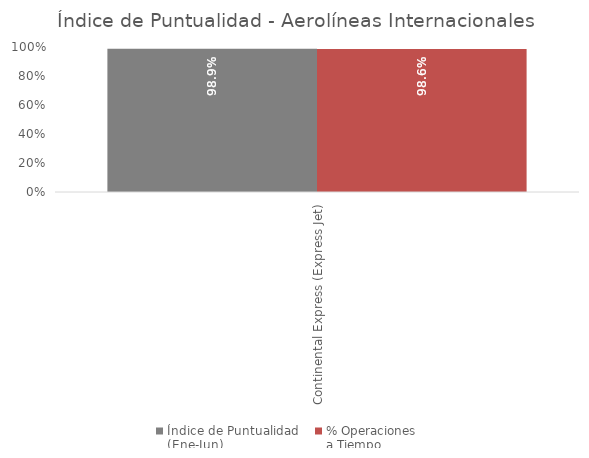
| Category | Índice de Puntualidad
(Ene-Jun) | % Operaciones 
a Tiempo |
|---|---|---|
| Continental Express (Express Jet) | 0.989 | 0.986 |